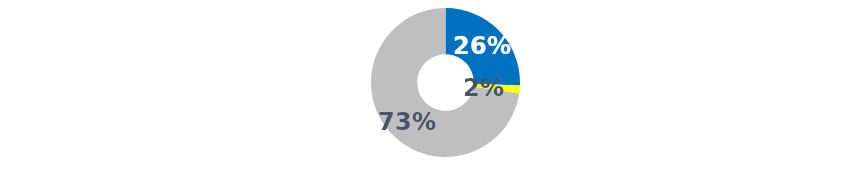
| Category | Series 0 |
|---|---|
| 0 | 30 |
| 1 | 0 |
| 2 | 2 |
| 3 | 0 |
| 4 | 0 |
| 5 | 85 |